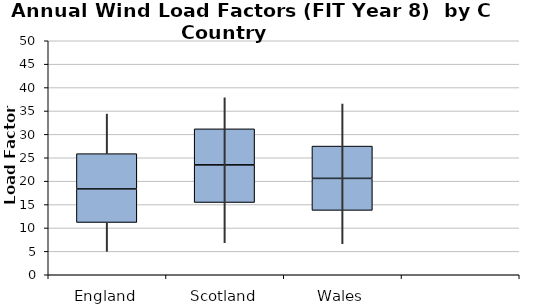
| Category | Series 0 | Series 1 | Series 2 |
|---|---|---|---|
| 0 | 11.174 | 7.164 | 7.539 |
| 1 | 15.443 | 8.039 | 7.696 |
| 2 | 13.757 | 6.835 | 6.905 |